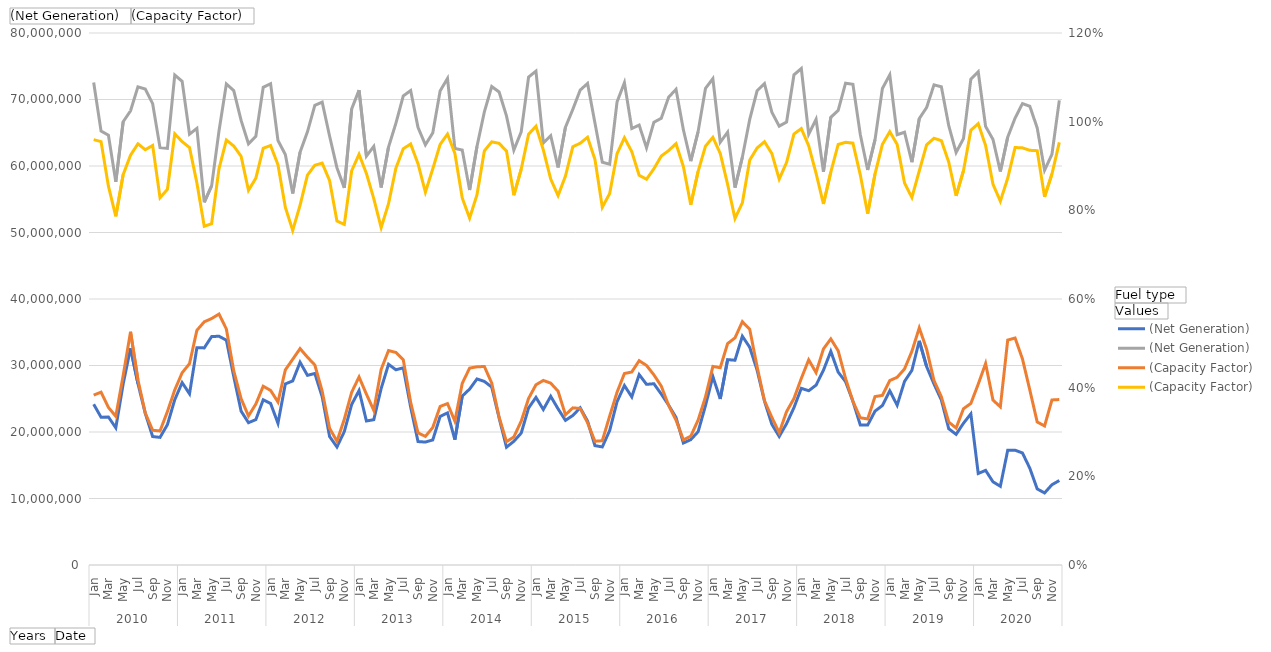
| Category | Hydro - (Net Generation) | Nuclear - (Net Generation) |
|---|---|---|
| 0 | 24157865 | 72569340 |
| 1 | 22230741 | 65245369 |
| 2 | 22260639 | 64634721 |
| 3 | 20627489 | 57611073 |
| 4 | 27231516 | 66658365 |
| 5 | 32587226 | 68301321 |
| 6 | 27300579 | 71913468 |
| 7 | 22799567 | 71574104 |
| 8 | 19313582 | 69371194 |
| 9 | 19191300 | 62750833 |
| 10 | 21100454 | 62655206 |
| 11 | 24860964 | 73683305 |
| 12 | 27424492 | 72742813 |
| 13 | 25745533 | 64789078 |
| 14 | 32665067 | 65661598 |
| 15 | 32647453 | 54547338 |
| 16 | 34346927 | 57012914 |
| 17 | 34403148 | 65270133 |
| 18 | 33805888 | 72344850 |
| 19 | 28346143 | 71338565 |
| 20 | 23138690 | 66848855 |
| 21 | 21400126 | 63336970 |
| 22 | 21865286 | 64473880 |
| 23 | 24846808 | 71837373 |
| 24 | 24293842 | 72381187 |
| 25 | 21311325 | 63847023 |
| 26 | 27230043 | 61728613 |
| 27 | 27677769 | 55870930 |
| 28 | 30484294 | 62081445 |
| 29 | 28520954 | 65140086 |
| 30 | 28801462 | 69129328 |
| 31 | 25289125 | 69602110 |
| 32 | 19326910 | 64510882 |
| 33 | 17751019 | 59743218 |
| 34 | 20061184 | 56712758 |
| 35 | 24141837 | 68583669 |
| 36 | 26239743 | 71405816 |
| 37 | 21657073 | 61483383 |
| 38 | 21852048 | 62947390 |
| 39 | 26547736 | 56766883 |
| 40 | 30186052 | 62848154 |
| 41 | 29357665 | 66429690 |
| 42 | 29649506 | 70539239 |
| 43 | 23756670 | 71344378 |
| 44 | 18559678 | 65798972 |
| 45 | 18487035 | 63183532 |
| 46 | 18805143 | 64975455 |
| 47 | 22337747 | 71293579 |
| 48 | 22873692 | 73162609 |
| 49 | 18849309 | 62638949 |
| 50 | 25404455 | 62397080 |
| 51 | 26452065 | 56384588 |
| 52 | 27976890 | 62947429 |
| 53 | 27604528 | 68138232 |
| 54 | 26755930 | 71940126 |
| 55 | 22123912 | 71128747 |
| 56 | 17710692 | 67534501 |
| 57 | 18598535 | 62390988 |
| 58 | 19837416 | 65140186 |
| 59 | 23613938 | 73362549 |
| 60 | 25204441 | 74269973 |
| 61 | 23381606 | 63461493 |
| 62 | 25366529 | 64546800 |
| 63 | 23484866 | 59784495 |
| 64 | 21749401 | 65826525 |
| 65 | 22485241 | 68516164 |
| 66 | 23637413 | 71412176 |
| 67 | 21639187 | 72415352 |
| 68 | 17949825 | 66476372 |
| 69 | 17757800 | 60570922 |
| 70 | 20217972 | 60263941 |
| 71 | 24549053 | 69633664 |
| 72 | 26987987 | 72524775 |
| 73 | 25274467 | 65638141 |
| 74 | 28634281 | 66148894 |
| 75 | 27167604 | 62731845 |
| 76 | 27258410 | 66576493 |
| 77 | 25704160 | 67175325 |
| 78 | 24039043 | 70349347 |
| 79 | 22182442 | 71526405 |
| 80 | 18340919 | 65448177 |
| 81 | 18849076 | 60733343 |
| 82 | 20046415 | 65178775 |
| 83 | 23971428 | 71662429 |
| 84 | 28337308 | 73120612 |
| 85 | 24966597 | 63560372 |
| 86 | 30882547 | 65093199 |
| 87 | 30793570 | 56743351 |
| 88 | 34406447 | 61312753 |
| 89 | 32732768 | 67010781 |
| 90 | 29313307 | 71314218 |
| 91 | 24658704 | 72384219 |
| 92 | 21155427 | 68097918 |
| 93 | 19326865 | 65994787 |
| 94 | 21257192 | 66617853 |
| 95 | 23662165 | 73699571 |
| 96 | 26569717 | 74649039 |
| 97 | 26208049 | 64790030 |
| 98 | 27042664 | 67032657 |
| 99 | 29280901 | 59133154 |
| 100 | 32126697 | 67320248 |
| 101 | 29002002 | 68368656 |
| 102 | 27577469 | 72456008 |
| 103 | 24614343 | 72282467 |
| 104 | 21052676 | 64724753 |
| 105 | 21040022 | 59396905 |
| 106 | 23140839 | 63954370 |
| 107 | 23981416 | 71657288 |
| 108 | 26197355 | 73700843 |
| 109 | 24029785 | 64714895 |
| 110 | 27602994 | 65079692 |
| 111 | 29272841 | 60580927 |
| 112 | 33713539 | 67123545 |
| 113 | 29836053 | 68804878 |
| 114 | 27218491 | 72198595 |
| 115 | 24806894 | 71910684 |
| 116 | 20488601 | 66063580 |
| 117 | 19648071 | 62032622 |
| 118 | 21319813 | 64125425 |
| 119 | 22729051 | 73073575 |
| 120 | 13760404 | 74169646 |
| 121 | 14228171 | 65950342 |
| 122 | 12511722 | 63997210 |
| 123 | 11834200 | 59170016 |
| 124 | 17251552 | 64337971 |
| 125 | 17264024 | 67205083 |
| 126 | 16845813 | 69385441 |
| 127 | 14547488 | 68982187 |
| 128 | 11442207 | 65727317 |
| 129 | 10836013 | 59362465 |
| 130 | 12069907 | 61759978 |
| 131 | 12705156 | 69870978 |